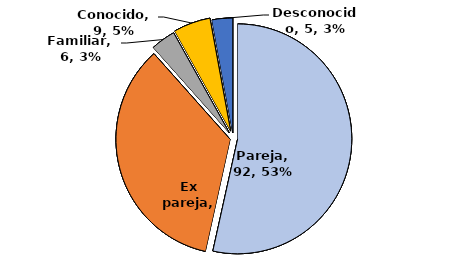
| Category | Series 0 |
|---|---|
| Pareja | 92 |
| Ex pareja | 60 |
| Familiar | 6 |
| Conocido | 9 |
| Desconocido | 5 |